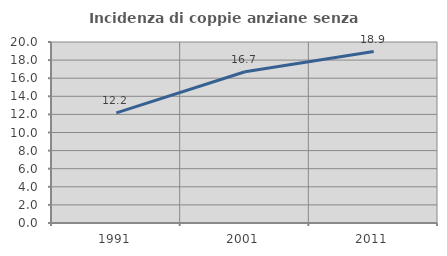
| Category | Incidenza di coppie anziane senza figli  |
|---|---|
| 1991.0 | 12.172 |
| 2001.0 | 16.712 |
| 2011.0 | 18.944 |